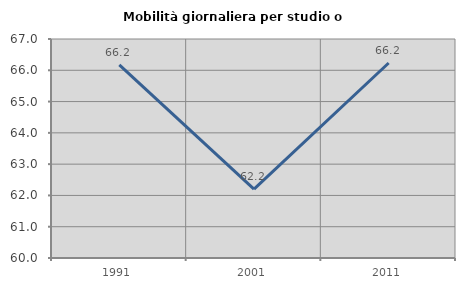
| Category | Mobilità giornaliera per studio o lavoro |
|---|---|
| 1991.0 | 66.174 |
| 2001.0 | 62.203 |
| 2011.0 | 66.233 |